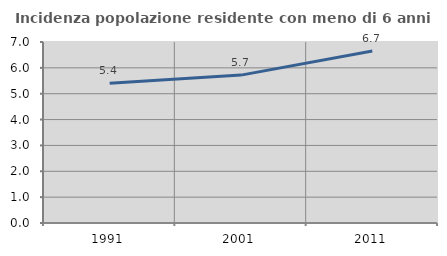
| Category | Incidenza popolazione residente con meno di 6 anni |
|---|---|
| 1991.0 | 5.408 |
| 2001.0 | 5.72 |
| 2011.0 | 6.651 |